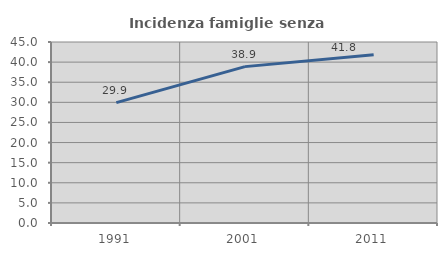
| Category | Incidenza famiglie senza nuclei |
|---|---|
| 1991.0 | 29.923 |
| 2001.0 | 38.878 |
| 2011.0 | 41.818 |